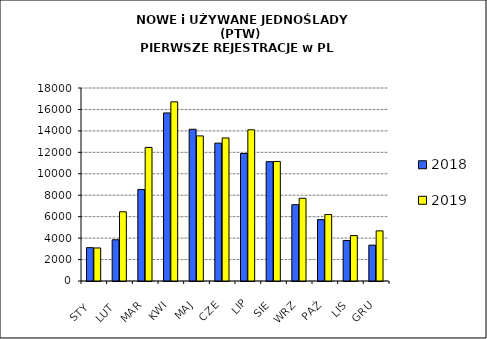
| Category | 2018 | 2019 |
|---|---|---|
|  STY  | 3111 | 3082 |
|  LUT  | 3845 | 6453 |
| MAR | 8538 | 12461 |
| KWI | 15674 | 16711 |
| MAJ | 14150 | 13531 |
| CZE | 12858 | 13339 |
| LIP | 11890 | 14101 |
| SIE | 11127 | 11149 |
| WRZ | 7118 | 7714 |
| PAŹ | 5724 | 6197 |
| LIS | 3780 | 4236 |
| GRU | 3343 | 4676 |